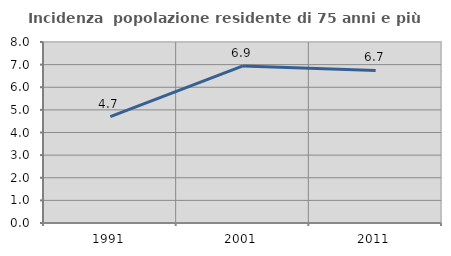
| Category | Incidenza  popolazione residente di 75 anni e più |
|---|---|
| 1991.0 | 4.698 |
| 2001.0 | 6.944 |
| 2011.0 | 6.742 |